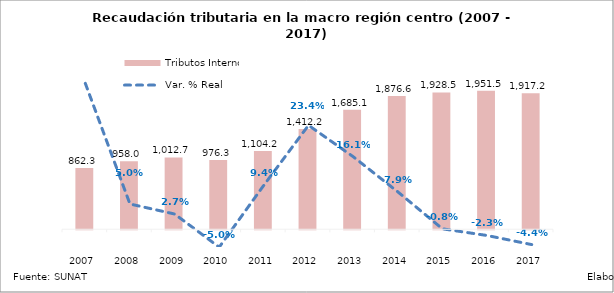
| Category | Tributos Internos |
|---|---|
| 2007.0 | 862.274 |
| 2008.0 | 958.047 |
| 2009.0 | 1012.711 |
| 2010.0 | 976.348 |
| 2011.0 | 1104.239 |
| 2012.0 | 1412.204 |
| 2013.0 | 1685.069 |
| 2014.0 | 1876.634 |
| 2015.0 | 1928.496 |
| 2016.0 | 1951.476 |
| 2017.0 | 1917.164 |